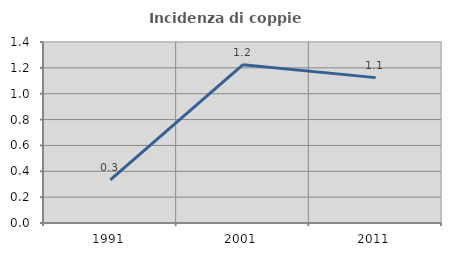
| Category | Incidenza di coppie miste |
|---|---|
| 1991.0 | 0.333 |
| 2001.0 | 1.224 |
| 2011.0 | 1.124 |